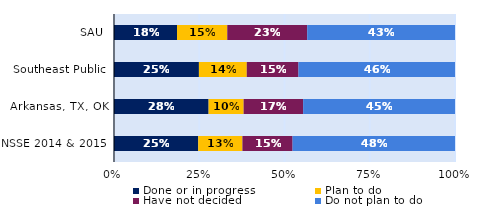
| Category | Done or in progress | Plan to do | Have not decided | Do not plan to do |
|---|---|---|---|---|
| SAU | 0.185 | 0.147 | 0.234 | 0.433 |
| Southeast Public | 0.249 | 0.14 | 0.152 | 0.459 |
| Arkansas, TX, OK | 0.277 | 0.103 | 0.174 | 0.445 |
| NSSE 2014 & 2015 | 0.247 | 0.13 | 0.147 | 0.476 |